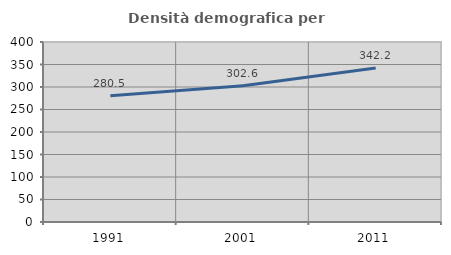
| Category | Densità demografica |
|---|---|
| 1991.0 | 280.545 |
| 2001.0 | 302.635 |
| 2011.0 | 342.17 |